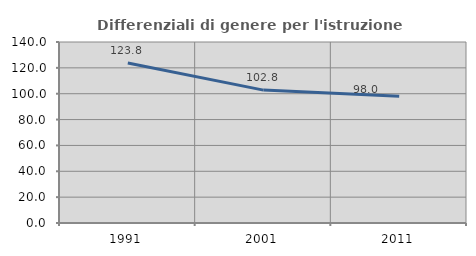
| Category | Differenziali di genere per l'istruzione superiore |
|---|---|
| 1991.0 | 123.788 |
| 2001.0 | 102.798 |
| 2011.0 | 98.043 |